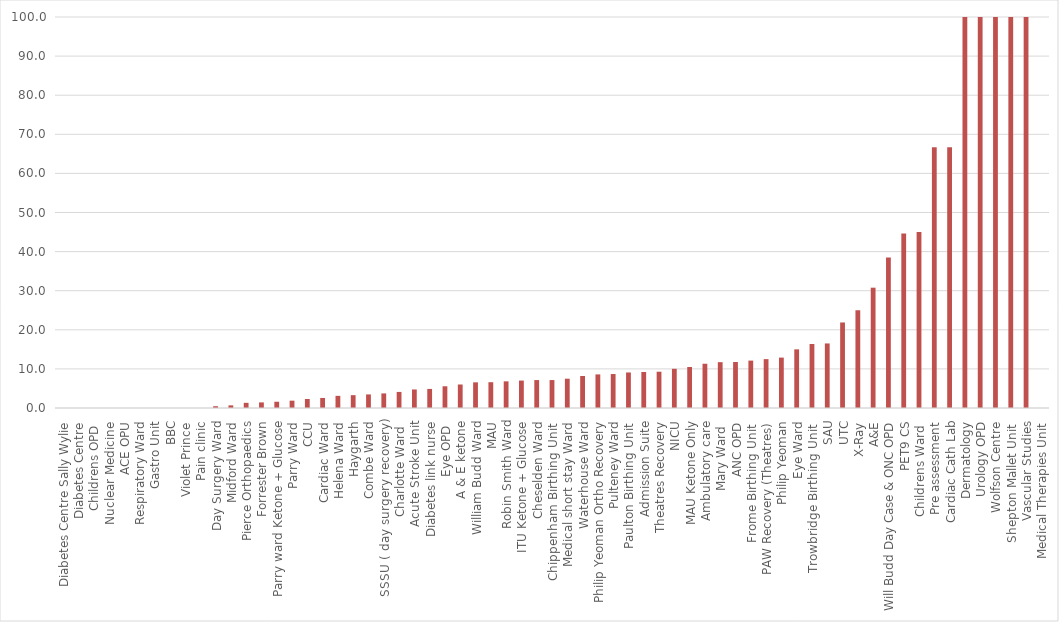
| Category | % of emergency ID Used |
|---|---|
| Diabetes Centre Sally Wylie | 0 |
| Diabetes Centre | 0 |
| Childrens OPD  | 0 |
| Nuclear Medicine | 0 |
| ACE OPU | 0 |
| Respiratory Ward | 0 |
| Gastro Unit | 0 |
| BBC | 0 |
| Violet Prince | 0 |
| Pain clinic | 0 |
| Day Surgery Ward | 0.454 |
| Midford Ward | 0.677 |
| Pierce Orthopaedics | 1.322 |
| Forrester Brown | 1.433 |
| Parry ward Ketone + Glucose | 1.598 |
| Parry Ward | 1.874 |
| CCU | 2.308 |
| Cardiac Ward | 2.568 |
| Helena Ward | 3.106 |
| Haygarth | 3.285 |
| Combe Ward | 3.472 |
| SSSU ( day surgery recovery) | 3.731 |
| Charlotte Ward  | 4.11 |
| Acute Stroke Unit | 4.738 |
| Diabetes link nurse | 4.878 |
| Eye OPD  | 5.556 |
| A & E ketone | 6.011 |
| William Budd Ward | 6.562 |
| MAU | 6.599 |
| Robin Smith Ward | 6.818 |
| ITU Ketone + Glucose | 7.018 |
| Cheselden Ward | 7.143 |
| Chippenham Birthing Unit  | 7.143 |
| Medical short stay Ward | 7.494 |
| Waterhouse Ward | 8.19 |
| Philip Yeoman Ortho Recovery | 8.591 |
| Pulteney Ward | 8.685 |
| Paulton Birthing Unit  | 9.091 |
| Admission Suite | 9.211 |
| Theatres Recovery | 9.278 |
| NICU | 10.021 |
| MAU Ketone Only | 10.484 |
| Ambulatory care | 11.321 |
| Mary Ward  | 11.724 |
| ANC OPD | 11.765 |
| Frome Birthing Unit  | 12.121 |
| PAW Recovery (Theatres) | 12.5 |
| Philip Yeoman | 12.889 |
| Eye Ward | 15 |
| Trowbridge Birthing Unit  | 16.364 |
| SAU | 16.509 |
| UTC | 21.875 |
| X-Ray | 25 |
| A&E | 30.769 |
| Will Budd Day Case & ONC OPD | 38.462 |
| PET9 CS | 44.643 |
| Childrens Ward  | 45 |
| Pre assessment | 66.667 |
| Cardiac Cath Lab | 66.667 |
| Dermatology | 100 |
| Urology OPD | 100 |
| Wolfson Centre | 100 |
| Shepton Mallet Unit  | 100 |
| Vascular Studies | 100 |
| Medical Therapies Unit | 0 |